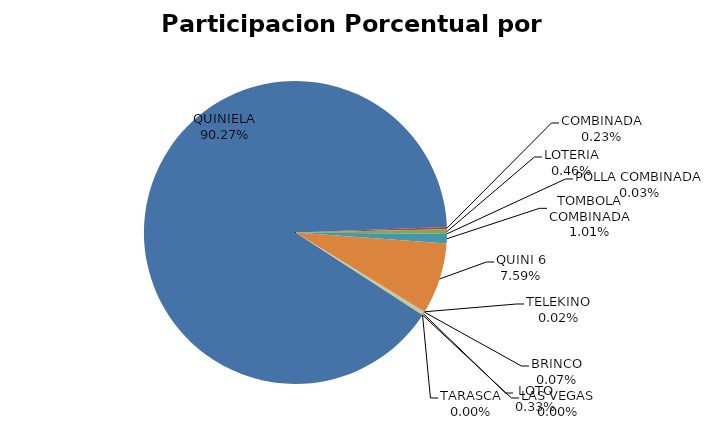
| Category | Series 0 |
|---|---|
| QUINIELA | 79228737.76 |
| COMBINADA | 202479.255 |
| LOTERIA | 406342.17 |
| POLLA COMBINADA | 22167.5 |
| TOMBOLA COMBINADA | 884435 |
| QUINI 6 | 6664949.64 |
| TELEKINO | 18022 |
| BRINCO | 59422.79 |
| LOTO | 284600 |
| TARASCA | 0 |
| LAS VEGAS | 0 |